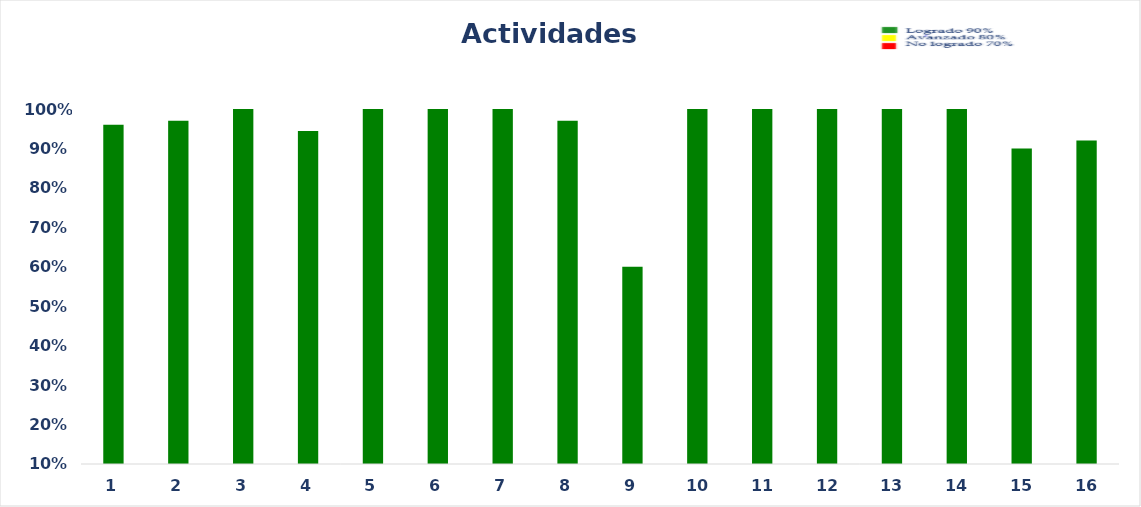
| Category | Series 0 |
|---|---|
| 0 | 0.96 |
| 1 | 0.97 |
| 2 | 1 |
| 3 | 0.944 |
| 4 | 1 |
| 5 | 1 |
| 6 | 1 |
| 7 | 0.97 |
| 8 | 0.6 |
| 9 | 1 |
| 10 | 1 |
| 11 | 1 |
| 12 | 1 |
| 13 | 1 |
| 14 | 0.9 |
| 15 | 0.92 |